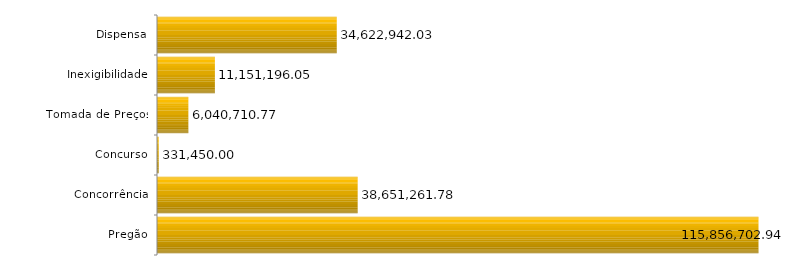
| Category | Series 0 |
|---|---|
| Pregão | 115856702.94 |
| Concorrência | 38651261.78 |
| Concurso | 331450 |
| Tomada de Preços | 6040710.77 |
| Inexigibilidade | 11151196.05 |
| Dispensa | 34622942.03 |